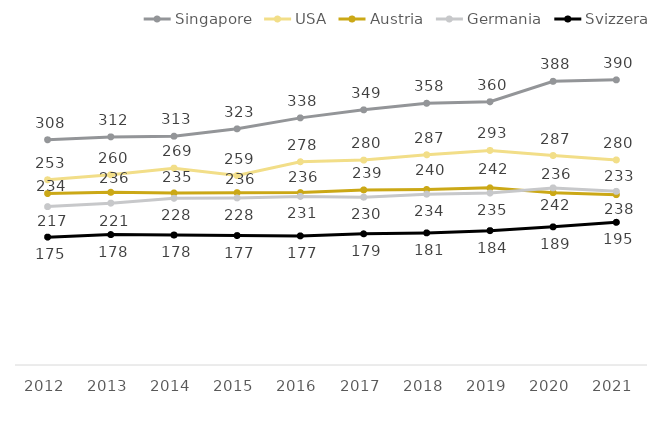
| Category | Singapore | USA | Austria | Germania | Svizzera |
|---|---|---|---|---|---|
| 2012.0 | 308 | 253.305 | 234.465 | 216.674 | 174.888 |
| 2013.0 | 312 | 260.134 | 236.282 | 221.337 | 178.436 |
| 2014.0 | 313 | 269.234 | 235.418 | 228.008 | 177.772 |
| 2015.0 | 323 | 259.167 | 235.701 | 228.494 | 177.061 |
| 2016.0 | 338 | 278.026 | 235.837 | 230.557 | 176.594 |
| 2017.0 | 349 | 280.26 | 239.462 | 229.521 | 179.466 |
| 2018.0 | 358 | 287.494 | 240.081 | 233.669 | 180.712 |
| 2019.0 | 360 | 293.399 | 242.31 | 235.136 | 183.731 |
| 2020.0 | 388 | 286.539 | 235.727 | 242.253 | 188.932 |
| 2021.0 | 390 | 280.494 | 233 | 237.508 | 195.165 |